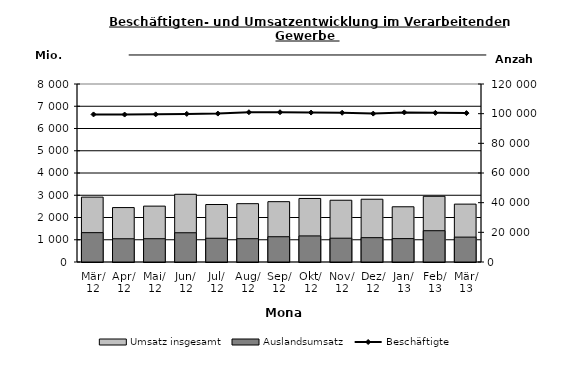
| Category | Umsatz insgesamt | Auslandsumsatz |
|---|---|---|
| 2012-03-01 | 2915.913 | 1319.032 |
| 2012-04-01 | 2446.427 | 1044.941 |
| 2012-05-01 | 2511.664 | 1046.581 |
| 2012-06-01 | 3043.821 | 1314.446 |
| 2012-07-01 | 2583.605 | 1066.984 |
| 2012-08-01 | 2621.741 | 1047.425 |
| 2012-09-01 | 2712.074 | 1135.543 |
| 2012-10-01 | 2855.379 | 1172.066 |
| 2012-11-01 | 2775.413 | 1069.743 |
| 2012-12-01 | 2821.024 | 1093.843 |
| 2013-01-01 | 2482.358 | 1051.73 |
| 2013-02-01 | 2953.548 | 1406.322 |
| 2013-03-01 | 2601.416 | 1118.337 |